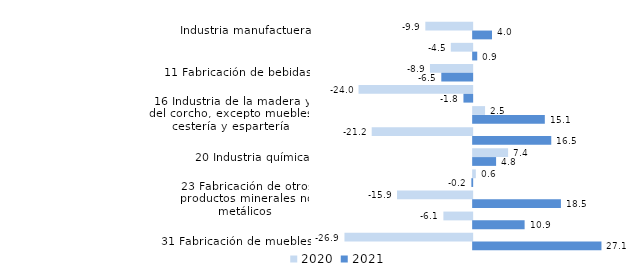
| Category | 2020 | 2021 |
|---|---|---|
| Industria manufactuera | -9.88 | 3.975 |
| 10 Industria de la alimentación | -4.502 | 0.859 |
| 11 Fabricación de bebidas | -8.901 | -6.511 |
| 15 Industria del cuero y del calzado | -23.981 | -1.839 |
| 16 Industria de la madera y del corcho, excepto muebles; cestería y espartería | 2.51 | 15.125 |
| 17 Industria del papel | -21.199 | 16.483 |
| 20 Industria química | 7.376 | 4.841 |
| 22 Fabricación de productos de caucho y plásticos | 0.565 | -0.166 |
| 23 Fabricación de otros productos minerales no metálicos | -15.855 | 18.525 |
| 25 Fabricación de productos metálicos, excepto maquinaria y equipo | -6.069 | 10.861 |
| 31 Fabricación de muebles | -26.946 | 27.077 |